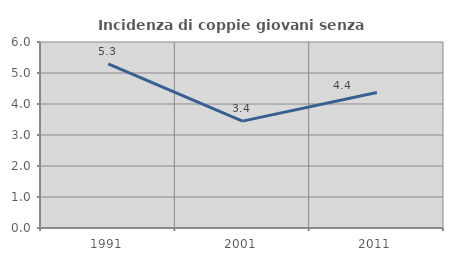
| Category | Incidenza di coppie giovani senza figli |
|---|---|
| 1991.0 | 5.294 |
| 2001.0 | 3.448 |
| 2011.0 | 4.372 |